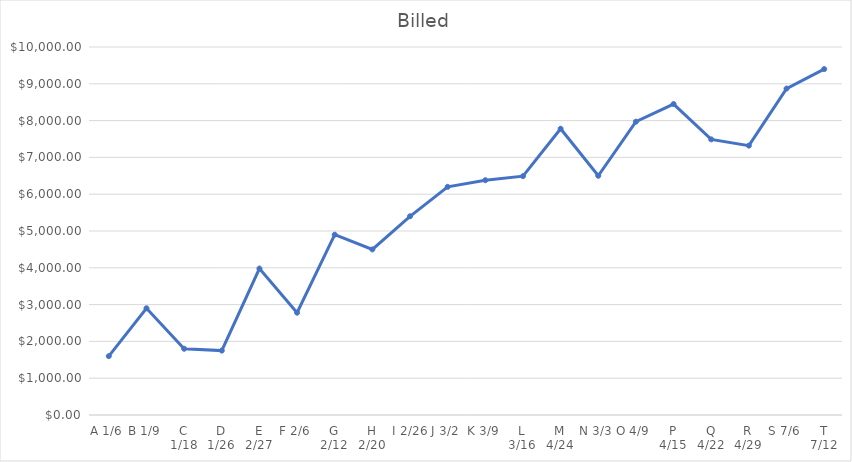
| Category | Series 0 |
|---|---|
| A 1/6 | 1600 |
| B 1/9 | 2900 |
| C 1/18 | 1800 |
| D 1/26 | 1750 |
| E 2/27 | 3980 |
| F 2/6 | 2780 |
| G 2/12 | 4900 |
| H 2/20 | 4500 |
| I 2/26 | 5400 |
| J 3/2 | 6200 |
| K 3/9 | 6380 |
| L 3/16 | 6490 |
| M 4/24 | 7780 |
| N 3/3 | 6500 |
| O 4/9 | 7970 |
| P 4/15 | 8450 |
| Q 4/22 | 7490 |
| R 4/29 | 7320 |
| S 7/6 | 8870 |
| T 7/12 | 9400 |